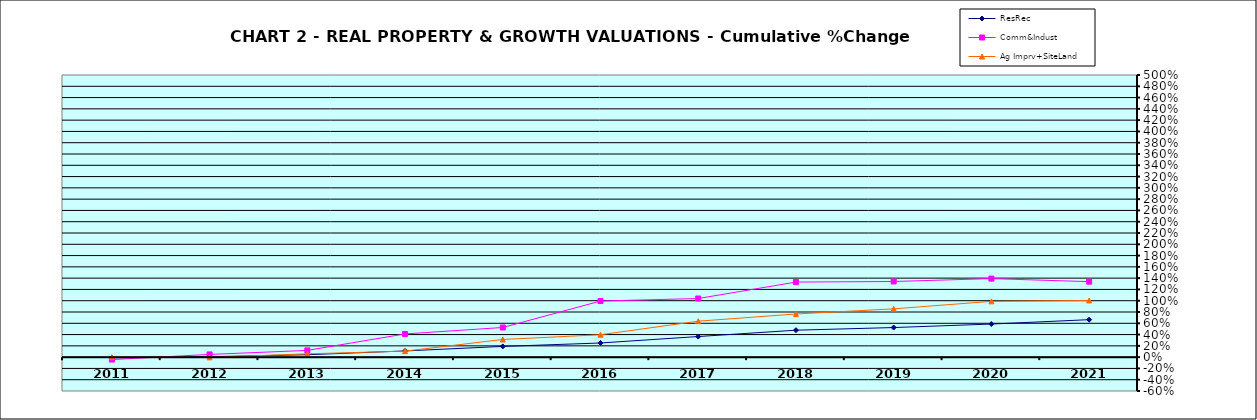
| Category | ResRec | Comm&Indust | Ag Imprv+SiteLand |
|---|---|---|---|
| 2011.0 | -0.011 | -0.043 | 0 |
| 2012.0 | 0.008 | 0.048 | -0.003 |
| 2013.0 | 0.043 | 0.12 | 0.058 |
| 2014.0 | 0.11 | 0.411 | 0.107 |
| 2015.0 | 0.19 | 0.526 | 0.313 |
| 2016.0 | 0.251 | 0.994 | 0.397 |
| 2017.0 | 0.365 | 1.039 | 0.637 |
| 2018.0 | 0.477 | 1.33 | 0.765 |
| 2019.0 | 0.525 | 1.341 | 0.856 |
| 2020.0 | 0.587 | 1.392 | 0.989 |
| 2021.0 | 0.664 | 1.338 | 1.005 |